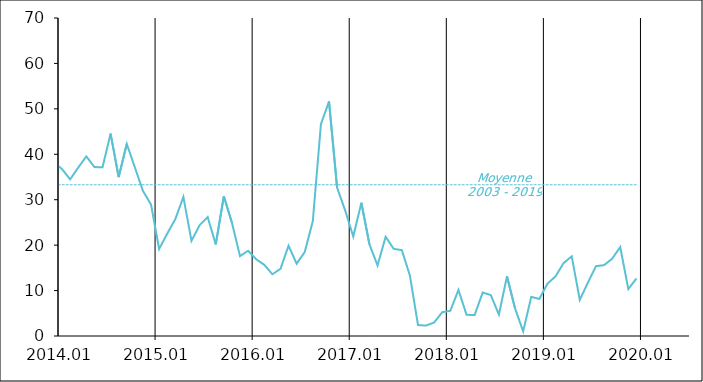
| Category | Series 1 | Moyenne
2003 - 2019 |
|---|---|---|
| 2003-01-20 | 36 | 33.291 |
| 2003-02-20 | 49 | 33.291 |
| 2003-03-20 | 48 | 33.291 |
| 2003-04-20 | 44 | 33.291 |
| 2003-05-20 | 45 | 33.291 |
| 2003-06-20 | 46 | 33.291 |
| 2003-07-20 | 43 | 33.291 |
| 2003-08-20 | 45 | 33.291 |
| 2003-09-20 | 40 | 33.291 |
| 2003-10-20 | 49 | 33.291 |
| 2003-11-20 | 38 | 33.291 |
| 2003-12-20 | 38 | 33.291 |
| 2004-01-20 | 39 | 33.291 |
| 2004-02-20 | 42 | 33.291 |
| 2004-03-20 | 40 | 33.291 |
| 2004-04-20 | 43 | 33.291 |
| 2004-05-20 | 41 | 33.291 |
| 2004-06-20 | 39 | 33.291 |
| 2004-07-20 | 35 | 33.291 |
| 2004-08-20 | 38 | 33.291 |
| 2004-09-20 | 44 | 33.291 |
| 2004-10-20 | 42 | 33.291 |
| 2004-11-20 | 43 | 33.291 |
| 2004-12-20 | 37 | 33.291 |
| 2005-01-20 | 45 | 33.291 |
| 2005-02-20 | 38 | 33.291 |
| 2005-03-20 | 40 | 33.291 |
| 2005-04-20 | 42 | 33.291 |
| 2005-05-20 | 47 | 33.291 |
| 2005-06-20 | 44 | 33.291 |
| 2005-07-20 | 48 | 33.291 |
| 2005-08-20 | 46 | 33.291 |
| 2005-09-20 | 41 | 33.291 |
| 2005-10-20 | 38 | 33.291 |
| 2005-11-20 | 40 | 33.291 |
| 2005-12-20 | 32 | 33.291 |
| 2006-01-20 | 37 | 33.291 |
| 2006-02-20 | 37 | 33.291 |
| 2006-03-20 | 42 | 33.291 |
| 2006-04-20 | 37 | 33.291 |
| 2006-05-20 | 34 | 33.291 |
| 2006-06-20 | 31 | 33.291 |
| 2006-07-20 | 31 | 33.291 |
| 2006-08-20 | 26 | 33.291 |
| 2006-09-20 | 29 | 33.291 |
| 2006-10-20 | 22 | 33.291 |
| 2006-11-20 | 23 | 33.291 |
| 2006-12-20 | 49 | 33.291 |
| 2007-01-20 | 37 | 33.291 |
| 2007-02-20 | 26 | 33.291 |
| 2007-03-20 | 25 | 33.291 |
| 2007-04-20 | 20 | 33.291 |
| 2007-05-20 | 17 | 33.291 |
| 2007-06-20 | 20 | 33.291 |
| 2007-07-20 | 22 | 33.291 |
| 2007-08-20 | 18 | 33.291 |
| 2007-09-20 | 18 | 33.291 |
| 2007-10-20 | 7 | 33.291 |
| 2007-11-20 | 18 | 33.291 |
| 2007-12-20 | 6 | 33.291 |
| 2008-01-20 | 8 | 33.291 |
| 2008-02-20 | 10 | 33.291 |
| 2008-03-20 | 4 | 33.291 |
| 2008-04-20 | 13 | 33.291 |
| 2008-05-20 | 12 | 33.291 |
| 2008-06-20 | 17 | 33.291 |
| 2008-07-20 | 17 | 33.291 |
| 2008-08-20 | 24 | 33.291 |
| 2008-09-20 | 27 | 33.291 |
| 2008-10-20 | 41 | 33.291 |
| 2008-11-20 | 57 | 33.291 |
| 2008-12-20 | 62 | 33.291 |
| 2009-01-20 | 71 | 33.291 |
| 2009-02-20 | 78 | 33.291 |
| 2009-03-20 | 73 | 33.291 |
| 2009-04-20 | 79 | 33.291 |
| 2009-05-20 | 76 | 33.291 |
| 2009-06-20 | 73 | 33.291 |
| 2009-07-20 | 73 | 33.291 |
| 2009-08-20 | 74 | 33.291 |
| 2009-09-20 | 75 | 33.291 |
| 2009-10-20 | 67 | 33.291 |
| 2009-11-20 | 66 | 33.291 |
| 2009-12-20 | 64 | 33.291 |
| 2010-01-20 | 71 | 33.291 |
| 2010-02-20 | 68 | 33.291 |
| 2010-03-20 | 65 | 33.291 |
| 2010-04-20 | 53 | 33.291 |
| 2010-05-20 | 46 | 33.291 |
| 2010-06-20 | 43 | 33.291 |
| 2010-07-20 | 37 | 33.291 |
| 2010-08-20 | 36 | 33.291 |
| 2010-09-20 | 39 | 33.291 |
| 2010-10-20 | 38 | 33.291 |
| 2010-11-20 | 31 | 33.291 |
| 2010-12-20 | 25 | 33.291 |
| 2011-01-20 | 29 | 33.291 |
| 2011-02-20 | 22 | 33.291 |
| 2011-03-20 | 17 | 33.291 |
| 2011-04-20 | 17 | 33.291 |
| 2011-05-20 | 14 | 33.291 |
| 2011-06-20 | 24 | 33.291 |
| 2011-07-20 | 22 | 33.291 |
| 2011-08-20 | 25 | 33.291 |
| 2011-09-20 | 35 | 33.291 |
| 2011-10-20 | 31 | 33.291 |
| 2011-11-20 | 50 | 33.291 |
| 2011-12-20 | 31 | 33.291 |
| 2012-01-20 | 36 | 33.291 |
| 2012-02-20 | 42 | 33.291 |
| 2012-03-20 | 35 | 33.291 |
| 2012-04-20 | 44 | 33.291 |
| 2012-05-20 | 40 | 33.291 |
| 2012-06-20 | 38 | 33.291 |
| 2012-07-20 | 40 | 33.291 |
| 2012-08-20 | 50 | 33.291 |
| 2012-09-20 | 46 | 33.291 |
| 2012-10-20 | 54 | 33.291 |
| 2012-11-20 | 58.447 | 33.291 |
| 2012-12-20 | 54.393 | 33.291 |
| 2013-01-20 | 52.127 | 33.291 |
| 2013-02-20 | 59.702 | 33.291 |
| 2013-03-20 | 62.306 | 33.291 |
| 2013-04-20 | 62.628 | 33.291 |
| 2013-05-20 | 63.233 | 33.291 |
| 2013-06-20 | 57.689 | 33.291 |
| 2013-07-20 | 55.803 | 33.291 |
| 2013-08-20 | 49.883 | 33.291 |
| 2013-09-20 | 46.548 | 33.291 |
| 2013-10-20 | 47.425 | 33.291 |
| 2013-11-20 | 41.46 | 33.291 |
| 2013-12-20 | 38.207 | 33.291 |
| 2014-01-20 | 36.747 | 33.291 |
| 2014-02-20 | 34.477 | 33.291 |
| 2014-03-20 | 37.079 | 33.291 |
| 2014-04-20 | 39.536 | 33.291 |
| 2014-05-20 | 37.194 | 33.291 |
| 2014-06-20 | 37.122 | 33.291 |
| 2014-07-20 | 44.549 | 33.291 |
| 2014-08-20 | 34.97 | 33.291 |
| 2014-09-20 | 42.287 | 33.291 |
| 2014-10-20 | 37.125 | 33.291 |
| 2014-11-20 | 31.938 | 33.291 |
| 2014-12-20 | 28.931 | 33.291 |
| 2015-01-20 | 19.146 | 33.291 |
| 2015-02-20 | 22.537 | 33.291 |
| 2015-03-20 | 25.725 | 33.291 |
| 2015-04-20 | 30.614 | 33.291 |
| 2015-05-20 | 20.941 | 33.291 |
| 2015-06-20 | 24.376 | 33.291 |
| 2015-07-20 | 26.191 | 33.291 |
| 2015-08-20 | 20.154 | 33.291 |
| 2015-09-20 | 30.781 | 33.291 |
| 2015-10-20 | 24.923 | 33.291 |
| 2015-11-20 | 17.584 | 33.291 |
| 2015-12-20 | 18.769 | 33.291 |
| 2016-01-20 | 16.889 | 33.291 |
| 2016-02-20 | 15.669 | 33.291 |
| 2016-03-20 | 13.583 | 33.291 |
| 2016-04-20 | 14.774 | 33.291 |
| 2016-05-20 | 19.87 | 33.291 |
| 2016-06-20 | 15.923 | 33.291 |
| 2016-07-20 | 18.488 | 33.291 |
| 2016-08-20 | 25.309 | 33.291 |
| 2016-09-20 | 46.606 | 33.291 |
| 2016-10-20 | 51.645 | 33.291 |
| 2016-11-20 | 32.671 | 33.291 |
| 2016-12-20 | 27.611 | 33.291 |
| 2017-01-20 | 21.889 | 33.291 |
| 2017-02-20 | 29.336 | 33.291 |
| 2017-03-20 | 20.162 | 33.291 |
| 2017-04-20 | 15.539 | 33.291 |
| 2017-05-20 | 21.833 | 33.291 |
| 2017-06-20 | 19.177 | 33.291 |
| 2017-07-20 | 18.9 | 33.291 |
| 2017-08-20 | 13.307 | 33.291 |
| 2017-09-20 | 2.409 | 33.291 |
| 2017-10-20 | 2.297 | 33.291 |
| 2017-11-20 | 2.982 | 33.291 |
| 2017-12-20 | 5.242 | 33.291 |
| 2018-01-20 | 5.55 | 33.291 |
| 2018-02-20 | 10.137 | 33.291 |
| 2018-03-20 | 4.671 | 33.291 |
| 2018-04-20 | 4.616 | 33.291 |
| 2018-05-20 | 9.574 | 33.291 |
| 2018-06-20 | 9.008 | 33.291 |
| 2018-07-20 | 4.711 | 33.291 |
| 2018-08-20 | 13.141 | 33.291 |
| 2018-09-20 | 6.059 | 33.291 |
| 2018-10-20 | 1.025 | 33.291 |
| 2018-11-20 | 8.619 | 33.291 |
| 2018-12-20 | 8.151 | 33.291 |
| 2019-01-20 | 11.512 | 33.291 |
| 2019-02-20 | 13.128 | 33.291 |
| 2019-03-20 | 16.056 | 33.291 |
| 2019-04-20 | 17.534 | 33.291 |
| 2019-05-20 | 7.957 | 33.291 |
| 2019-06-20 | 11.739 | 33.291 |
| 2019-07-20 | 15.368 | 33.291 |
| 2019-08-20 | 15.596 | 33.291 |
| 2019-09-20 | 17.016 | 33.291 |
| 2019-10-20 | 19.58 | 33.291 |
| 2019-11-20 | 10.331 | 33.291 |
| 2019-12-20 | 12.666 | 33.291 |